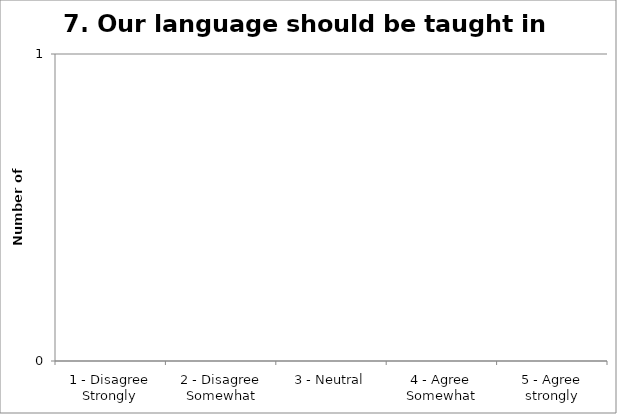
| Category | 7. Our language should be taught in schools  |
|---|---|
| 1 - Disagree Strongly | 0 |
| 2 - Disagree Somewhat | 0 |
| 3 - Neutral | 0 |
| 4 - Agree Somewhat | 0 |
| 5 - Agree strongly | 0 |